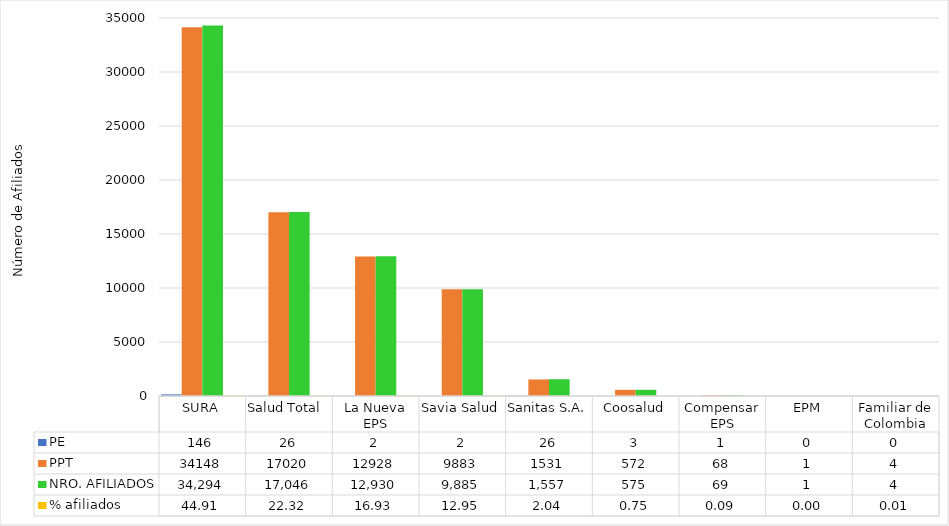
| Category | PE | PPT | NRO. AFILIADOS | % afiliados |
|---|---|---|---|---|
| SURA | 146 | 34148 | 34294 | 44.91 |
| Salud Total  | 26 | 17020 | 17046 | 22.323 |
| La Nueva EPS | 2 | 12928 | 12930 | 16.933 |
| Savia Salud | 2 | 9883 | 9885 | 12.945 |
| Sanitas S.A. | 26 | 1531 | 1557 | 2.039 |
| Coosalud | 3 | 572 | 575 | 0.753 |
| Compensar EPS | 1 | 68 | 69 | 0.09 |
| EPM | 0 | 1 | 1 | 0.001 |
| Familiar de Colombia | 0 | 4 | 4 | 0.005 |